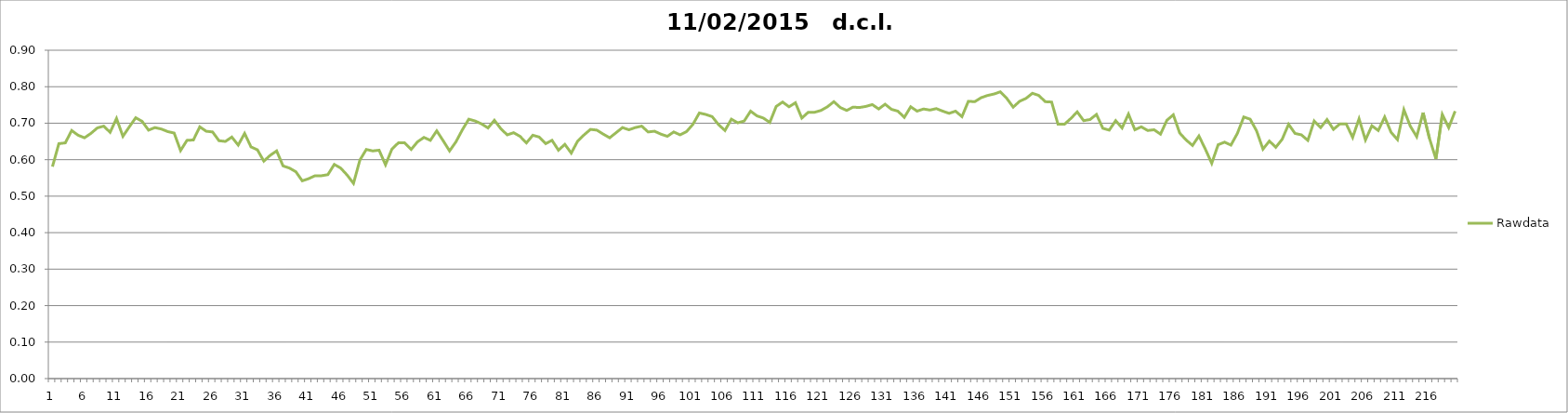
| Category | Rawdata |
|---|---|
| 0 | 0.581 |
| 1 | 0.644 |
| 2 | 0.646 |
| 3 | 0.68 |
| 4 | 0.667 |
| 5 | 0.66 |
| 6 | 0.672 |
| 7 | 0.687 |
| 8 | 0.692 |
| 9 | 0.675 |
| 10 | 0.713 |
| 11 | 0.664 |
| 12 | 0.69 |
| 13 | 0.715 |
| 14 | 0.705 |
| 15 | 0.681 |
| 16 | 0.688 |
| 17 | 0.684 |
| 18 | 0.677 |
| 19 | 0.673 |
| 20 | 0.625 |
| 21 | 0.653 |
| 22 | 0.654 |
| 23 | 0.69 |
| 24 | 0.678 |
| 25 | 0.676 |
| 26 | 0.652 |
| 27 | 0.65 |
| 28 | 0.662 |
| 29 | 0.64 |
| 30 | 0.672 |
| 31 | 0.635 |
| 32 | 0.627 |
| 33 | 0.596 |
| 34 | 0.612 |
| 35 | 0.624 |
| 36 | 0.583 |
| 37 | 0.577 |
| 38 | 0.567 |
| 39 | 0.542 |
| 40 | 0.548 |
| 41 | 0.556 |
| 42 | 0.556 |
| 43 | 0.559 |
| 44 | 0.587 |
| 45 | 0.577 |
| 46 | 0.558 |
| 47 | 0.535 |
| 48 | 0.599 |
| 49 | 0.628 |
| 50 | 0.624 |
| 51 | 0.626 |
| 52 | 0.586 |
| 53 | 0.629 |
| 54 | 0.646 |
| 55 | 0.646 |
| 56 | 0.628 |
| 57 | 0.649 |
| 58 | 0.661 |
| 59 | 0.653 |
| 60 | 0.679 |
| 61 | 0.652 |
| 62 | 0.624 |
| 63 | 0.649 |
| 64 | 0.682 |
| 65 | 0.711 |
| 66 | 0.706 |
| 67 | 0.698 |
| 68 | 0.687 |
| 69 | 0.708 |
| 70 | 0.685 |
| 71 | 0.668 |
| 72 | 0.674 |
| 73 | 0.664 |
| 74 | 0.646 |
| 75 | 0.667 |
| 76 | 0.662 |
| 77 | 0.644 |
| 78 | 0.653 |
| 79 | 0.626 |
| 80 | 0.642 |
| 81 | 0.618 |
| 82 | 0.651 |
| 83 | 0.668 |
| 84 | 0.683 |
| 85 | 0.681 |
| 86 | 0.67 |
| 87 | 0.66 |
| 88 | 0.674 |
| 89 | 0.688 |
| 90 | 0.682 |
| 91 | 0.688 |
| 92 | 0.692 |
| 93 | 0.676 |
| 94 | 0.678 |
| 95 | 0.67 |
| 96 | 0.664 |
| 97 | 0.676 |
| 98 | 0.668 |
| 99 | 0.677 |
| 100 | 0.697 |
| 101 | 0.728 |
| 102 | 0.724 |
| 103 | 0.718 |
| 104 | 0.696 |
| 105 | 0.68 |
| 106 | 0.711 |
| 107 | 0.701 |
| 108 | 0.706 |
| 109 | 0.733 |
| 110 | 0.72 |
| 111 | 0.714 |
| 112 | 0.702 |
| 113 | 0.746 |
| 114 | 0.758 |
| 115 | 0.745 |
| 116 | 0.756 |
| 117 | 0.714 |
| 118 | 0.73 |
| 119 | 0.73 |
| 120 | 0.735 |
| 121 | 0.745 |
| 122 | 0.759 |
| 123 | 0.743 |
| 124 | 0.735 |
| 125 | 0.744 |
| 126 | 0.743 |
| 127 | 0.746 |
| 128 | 0.751 |
| 129 | 0.739 |
| 130 | 0.752 |
| 131 | 0.738 |
| 132 | 0.733 |
| 133 | 0.716 |
| 134 | 0.745 |
| 135 | 0.733 |
| 136 | 0.739 |
| 137 | 0.736 |
| 138 | 0.74 |
| 139 | 0.733 |
| 140 | 0.727 |
| 141 | 0.733 |
| 142 | 0.718 |
| 143 | 0.76 |
| 144 | 0.759 |
| 145 | 0.77 |
| 146 | 0.776 |
| 147 | 0.78 |
| 148 | 0.786 |
| 149 | 0.768 |
| 150 | 0.744 |
| 151 | 0.76 |
| 152 | 0.768 |
| 153 | 0.782 |
| 154 | 0.776 |
| 155 | 0.759 |
| 156 | 0.758 |
| 157 | 0.697 |
| 158 | 0.697 |
| 159 | 0.713 |
| 160 | 0.731 |
| 161 | 0.707 |
| 162 | 0.71 |
| 163 | 0.724 |
| 164 | 0.686 |
| 165 | 0.681 |
| 166 | 0.707 |
| 167 | 0.687 |
| 168 | 0.725 |
| 169 | 0.682 |
| 170 | 0.69 |
| 171 | 0.68 |
| 172 | 0.682 |
| 173 | 0.67 |
| 174 | 0.708 |
| 175 | 0.723 |
| 176 | 0.673 |
| 177 | 0.654 |
| 178 | 0.639 |
| 179 | 0.665 |
| 180 | 0.629 |
| 181 | 0.59 |
| 182 | 0.641 |
| 183 | 0.648 |
| 184 | 0.64 |
| 185 | 0.672 |
| 186 | 0.717 |
| 187 | 0.711 |
| 188 | 0.679 |
| 189 | 0.629 |
| 190 | 0.651 |
| 191 | 0.634 |
| 192 | 0.656 |
| 193 | 0.697 |
| 194 | 0.672 |
| 195 | 0.668 |
| 196 | 0.653 |
| 197 | 0.706 |
| 198 | 0.688 |
| 199 | 0.71 |
| 200 | 0.683 |
| 201 | 0.698 |
| 202 | 0.698 |
| 203 | 0.661 |
| 204 | 0.712 |
| 205 | 0.654 |
| 206 | 0.693 |
| 207 | 0.68 |
| 208 | 0.717 |
| 209 | 0.675 |
| 210 | 0.655 |
| 211 | 0.737 |
| 212 | 0.692 |
| 213 | 0.663 |
| 214 | 0.729 |
| 215 | 0.658 |
| 216 | 0.602 |
| 217 | 0.724 |
| 218 | 0.688 |
| 219 | 0.733 |